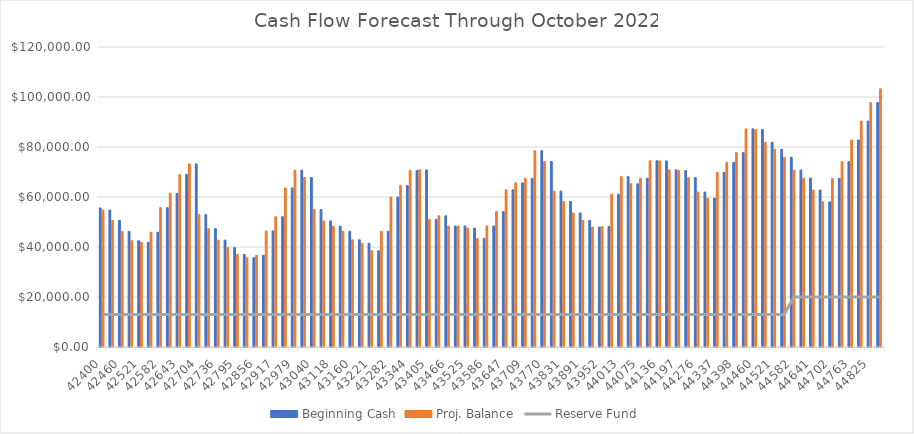
| Category | Beginning Cash | Proj. Balance |
|---|---|---|
| 2016-01-31 | 55621.26 | 54769.62 |
| 2016-02-28 | 54769.62 | 50656 |
| 2016-03-31 | 50656 | 46266.52 |
| 2016-04-30 | 46266.52 | 42487 |
| 2016-05-31 | 42487 | 41877 |
| 2016-06-30 | 41877 | 45904 |
| 2016-07-31 | 45904 | 55716 |
| 2016-08-31 | 55716 | 61446.91 |
| 2016-09-30 | 61446.91 | 68968 |
| 2016-10-31 | 68968 | 73241 |
| 2016-11-30 | 73241 | 52964.7 |
| 2016-12-01 | 52964.7 | 47341.47 |
| 2017-01-01 | 47341.47 | 42749.45 |
| 2017-02-01 | 42749.45 | 39736.78 |
| 2017-03-01 | 39736.78 | 37017.7 |
| 2017-04-01 | 37017.7 | 35720.92 |
| 2017-05-01 | 35720.92 | 36659.01 |
| 2017-06-01 | 36659.01 | 46429.73 |
| 2017-07-01 | 46429.73 | 52102.19 |
| 2017-08-01 | 52102.19 | 63613.38 |
| 2017-09-01 | 63613.38 | 70753.57 |
| 2017-10-01 | 70753.57 | 67800.19 |
| 2017-11-01 | 67800.19 | 55008.48 |
| 2017-12-01 | 55008.48 | 50422.9 |
| 2018-01-18 | 50422.9 | 48323.9 |
| 2018-02-18 | 48323.9 | 46308.67 |
| 2018-03-01 | 46308.67 | 42882.33 |
| 2018-04-01 | 42882.33 | 41522.84 |
| 2018-05-01 | 41522.84 | 38510.69 |
| 2018-06-01 | 38510.69 | 46292.8 |
| 2018-07-01 | 46292.8 | 59937.95 |
| 2018-08-01 | 59937.95 | 64527.47 |
| 2018-09-01 | 64527.47 | 70617 |
| 2018-10-01 | 70617 | 70867.09 |
| 2018-11-01 | 70867.09 | 51038.62 |
| 2018-12-01 | 51038.62 | 52496.11 |
| 2019-01-01 | 52496.11 | 48384.7 |
| 2019-02-01 | 48384.7 | 48370.56 |
| 2019-03-01 | 48370.56 | 47574.22 |
| 2019-04-01 | 47574.22 | 43411.19 |
| 2019-05-01 | 43411.19 | 48409.26 |
| 2019-06-01 | 48409.26 | 54132.88 |
| 2019-07-01 | 54132.88 | 62873.17 |
| 2019-08-01 | 62873.17 | 65640.16 |
| 2019-09-01 | 65640.16 | 67418.79 |
| 2019-10-01 | 67418.79 | 78527.86 |
| 2019-11-01 | 78527.86 | 74176.39 |
| 2019-12-01 | 74176.39 | 62370.61 |
| 2020-01-01 | 62370.61 | 58226.82 |
| 2020-02-01 | 58226.82 | 53619.22 |
| 2020-03-01 | 53619.22 | 50620.11 |
| 2020-04-01 | 50620.11 | 47945.89 |
| 2020-05-01 | 47945.89 | 48192.62 |
| 2020-06-01 | 48192.62 | 61082.25 |
| 2020-07-01 | 61082.25 | 68155.56 |
| 2020-08-01 | 68155.56 | 65293.29 |
| 2020-09-01 | 65293.29 | 67527.38 |
| 2020-10-01 | 67527.38 | 74493.79 |
| 2020-11-01 | 74493.79 | 74425.4 |
| 2020-12-01 | 74425.4 | 70837.56 |
| 2021-01-01 | 70837.56 | 70557.78 |
| 2021-02-01 | 70557.78 | 67728.94 |
| 2021-03-21 | 67728.94 | 61977.57 |
| 2021-04-21 | 61977.57 | 59550.07 |
| 2021-05-21 | 59550.07 | 69818.23 |
| 2021-06-21 | 69818.23 | 73869.56 |
| 2021-07-21 | 73869.56 | 77756.07 |
| 2021-08-21 | 77756.07 | 87247.52 |
| 2021-09-21 | 87247.52 | 86985.19 |
| 2021-10-21 | 86985.19 | 81917.02 |
| 2021-11-21 | 81917.02 | 79086.2 |
| 2021-12-21 | 79086.2 | 75895.87 |
| 2022-01-21 | 75895.87 | 70768.32 |
| 2022-02-21 | 70768.32 | 67575.89 |
| 2022-03-21 | 67575.89 | 62809.15 |
| 2022-04-21 | 62809.15 | 58067.17 |
| 2022-05-21 | 58067.1 | 67422.67 |
| 2022-06-21 | 67422.67 | 74098.48 |
| 2022-07-21 | 74098.48 | 82778.83 |
| 2022-08-21 | 82778.83 | 90371.69 |
| 2022-09-21 | 90371.69 | 97754.59 |
| 2022-10-21 | 97754.59 | 103267.89 |